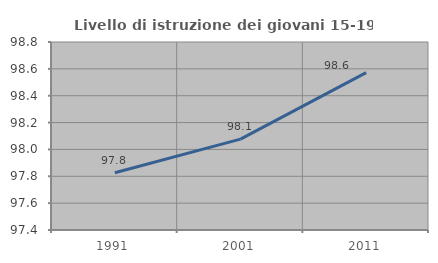
| Category | Livello di istruzione dei giovani 15-19 anni |
|---|---|
| 1991.0 | 97.826 |
| 2001.0 | 98.077 |
| 2011.0 | 98.571 |